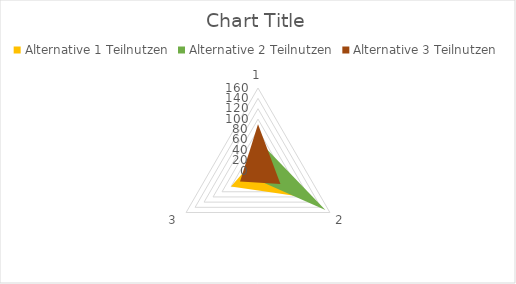
| Category | Kriterium | Gewichtung | Alternative 1 | Alternative 2 | Alternative 3 |
|---|---|---|---|---|---|
| 0 | 1 | 30 | 30 | 60 | 90 |
| 1 | 2 | 50 | 100 | 150 | 50 |
| 2 | 3 | 20 | 60 | 20 | 40 |